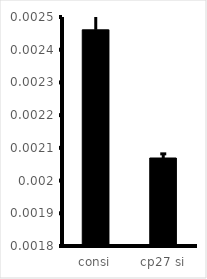
| Category | Series 0 |
|---|---|
| consi | 0.002 |
| cp27 si | 0.002 |